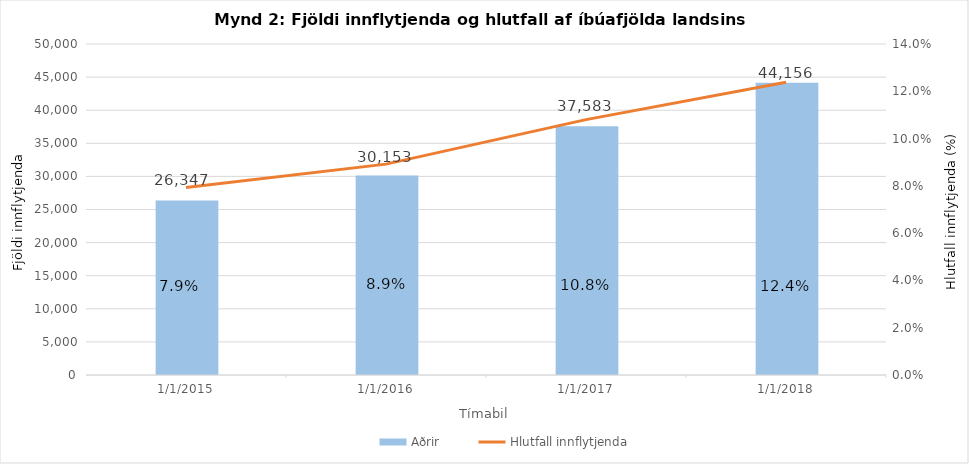
| Category | Aðrir |
|---|---|
| 12/1/15 | 26347 |
| 12/1/16 | 30153 |
| 12/1/17 | 37583 |
| 12/1/18 | 44156 |